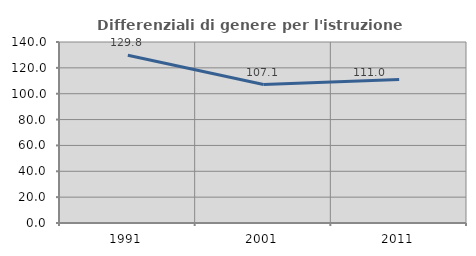
| Category | Differenziali di genere per l'istruzione superiore |
|---|---|
| 1991.0 | 129.77 |
| 2001.0 | 107.084 |
| 2011.0 | 110.952 |